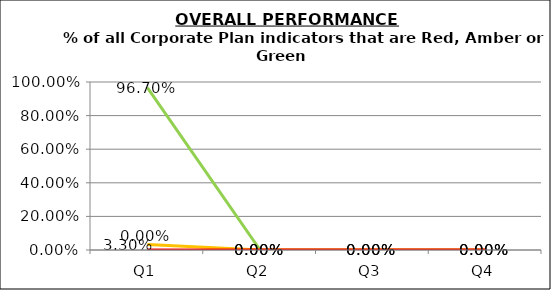
| Category | Green | Amber | Red |
|---|---|---|---|
| Q1 | 0.967 | 0.033 | 0 |
| Q2 | 0 | 0 | 0 |
| Q3 | 0 | 0 | 0 |
| Q4 | 0 | 0 | 0 |